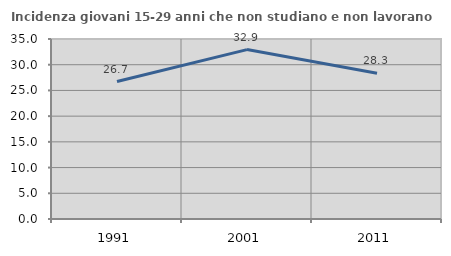
| Category | Incidenza giovani 15-29 anni che non studiano e non lavorano  |
|---|---|
| 1991.0 | 26.736 |
| 2001.0 | 32.941 |
| 2011.0 | 28.337 |